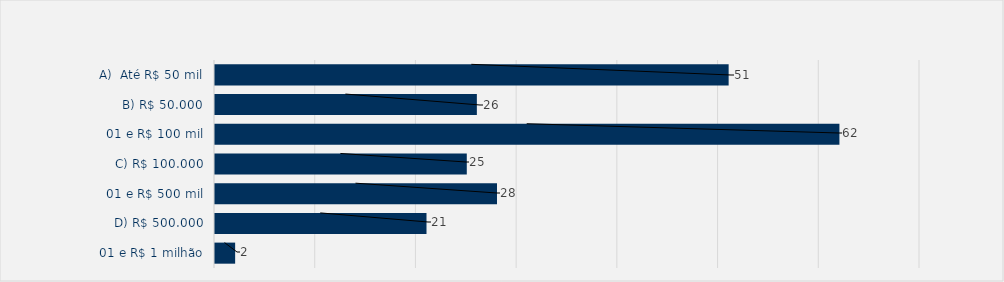
| Category | Total |
|---|---|
| A)  Até R$ 50 mil | 51 |
| B) R$ 50.000,01 e R$ 100 mil | 26 |
| C) R$ 100.000,01 e R$ 500 mil | 62 |
| D) R$ 500.000,01 e R$ 1 milhão | 25 |
| E) R$ 1.000.000,01 e R$ 5 milhões | 28 |
| F)  Superior a R$ 5 milhões | 21 |
| Sem valor autorizado | 2 |